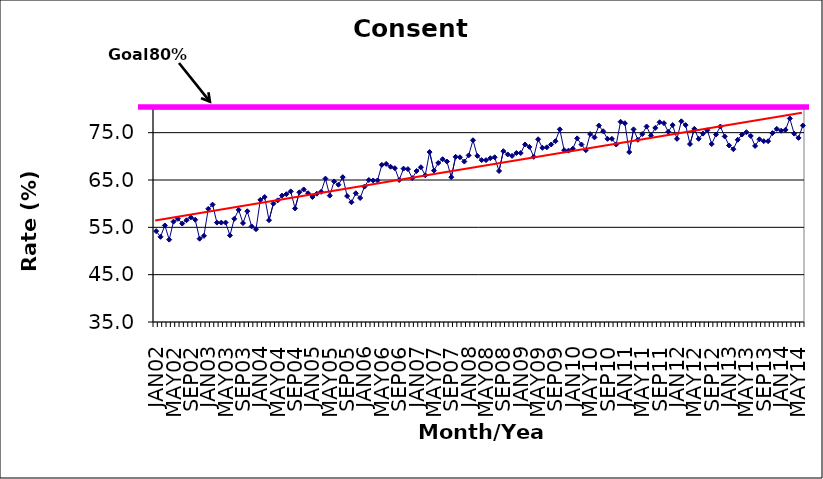
| Category | Series 0 |
|---|---|
| JAN02 | 54.2 |
| FEB02 | 53 |
| MAR02 | 55.4 |
| APR02 | 52.4 |
| MAY02 | 56.2 |
| JUN02 | 56.8 |
| JUL02 | 55.8 |
| AUG02 | 56.5 |
| SEP02 | 57.1 |
| OCT02 | 56.6 |
| NOV02 | 52.6 |
| DEC02 | 53.2 |
| JAN03 | 58.9 |
| FEB03 | 59.8 |
| MAR03 | 56 |
| APR03 | 56 |
| MAY03 | 56 |
| JUN03 | 53.3 |
| JUL03 | 56.8 |
| AUG03 | 58.7 |
| SEP03 | 55.9 |
| OCT03 | 58.4 |
| NOV03 | 55.2 |
| DEC03 | 54.6 |
| JAN04 | 60.8 |
| FEB04 | 61.4 |
| MAR04 | 56.5 |
| APR04 | 60 |
| MAY04 | 60.7 |
| JUN04 | 61.7 |
| JUL04 | 62 |
| AUG04 | 62.6 |
| SEP04 | 59 |
| OCT04 | 62.4 |
| NOV04 | 63 |
| DEC04 | 62.2 |
| JAN05 | 61.4 |
| FEB05 | 62.1 |
| MAR05 | 62.5 |
| APR05 | 65.3 |
| MAY05 | 61.7 |
| JUN05 | 64.7 |
| JUL05 | 64 |
| AUG05 | 65.6 |
| SEP05 | 61.6 |
| OCT05 | 60.3 |
| NOV05 | 62.2 |
| DEC05 | 61.2 |
| JAN06 | 63.6 |
| FEB06 | 65 |
| MAR06 | 64.9 |
| APR06 | 64.9 |
| MAY06 | 68.2 |
| JUN06 | 68.4 |
| JUL06 | 67.8 |
| AUG06 | 67.5 |
| SEP06 | 65 |
| OCT06 | 67.4 |
| NOV06 | 67.3 |
| DEC06 | 65.4 |
| JAN07 | 66.9 |
| FEB07 | 67.7 |
| MAR07 | 66 |
| APR07 | 70.9 |
| MAY07 | 67 |
| JUN07 | 68.6 |
| JUL07 | 69.4 |
| AUG07 | 68.9 |
| SEP07 | 65.6 |
| OCT07 | 69.9 |
| NOV07 | 69.8 |
| DEC07 | 68.9 |
| JAN08 | 70.2 |
| FEB08 | 73.4 |
| MAR08 | 70.1 |
| APR08 | 69.2 |
| MAY08 | 69.2 |
| JUN08 | 69.6 |
| JUL08 | 69.8 |
| AUG08 | 66.9 |
| SEP08 | 71.1 |
| OCT08 | 70.4 |
| NOV08 | 70.1 |
| DEC08 | 70.7 |
| JAN09 | 70.7 |
| FEB09 | 72.5 |
| MAR09 | 72 |
| APR09 | 69.9 |
| MAY09 | 73.6 |
| JUN09 | 71.8 |
| JUL09 | 71.9 |
| AUG09 | 72.5 |
| SEP09 | 73.2 |
| OCT09 | 75.7 |
| NOV09 | 71.3 |
| DEC09 | 71.2 |
| JAN10 | 71.6 |
| FEB10 | 73.8 |
| MAR10 | 72.5 |
| APR10 | 71.3 |
| MAY10 | 74.7 |
| JUN10 | 74 |
| JUL10 | 76.5 |
| AUG10 | 75.3 |
| SEP10 | 73.7 |
| OCT10 | 73.7 |
| NOV10 | 72.5 |
| DEC10 | 77.3 |
| JAN11 | 77 |
| FEB11 | 70.9 |
| MAR11 | 75.7 |
| APR11 | 73.5 |
| MAY11 | 74.7 |
| JUN11 | 76.3 |
| JUL11 | 74.4 |
| AUG11 | 76 |
| SEP11 | 77.2 |
| OCT11 | 77 |
| NOV11 | 75.2 |
| DEC11 | 76.6 |
| JAN12 | 73.7 |
| FEB12 | 77.4 |
| MAR12 | 76.6 |
| APR12 | 72.6 |
| MAY12 | 75.8 |
| JUN12 | 73.7 |
| JUL12 | 74.8 |
| AUG12 | 75.5 |
| SEP12 | 72.6 |
| OCT12 | 74.6 |
| NOV12 | 76.3 |
| DEC12 | 74.2 |
| JAN13 | 72.3 |
| FEB13 | 71.5 |
| MAR13 | 73.5 |
| APR13 | 74.6 |
| MAY13 | 75.1 |
| JUN13 | 74.3 |
| JUL13 | 72.2 |
| AUG13 | 73.6 |
| SEP13 | 73.2 |
| OCT13 | 73.2 |
| NOV13 | 74.9 |
| DEC13 | 75.8 |
| JAN14 | 75.4 |
| FEB14 | 75.6 |
| MAR14 | 78 |
| APR14 | 74.8 |
| MAY14 | 73.9 |
| JUN14 | 76.5 |